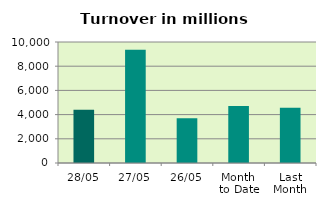
| Category | Series 0 |
|---|---|
| 28/05 | 4404.788 |
| 27/05 | 9351.071 |
| 26/05 | 3699.18 |
| Month 
to Date | 4703.145 |
| Last
Month | 4573.802 |